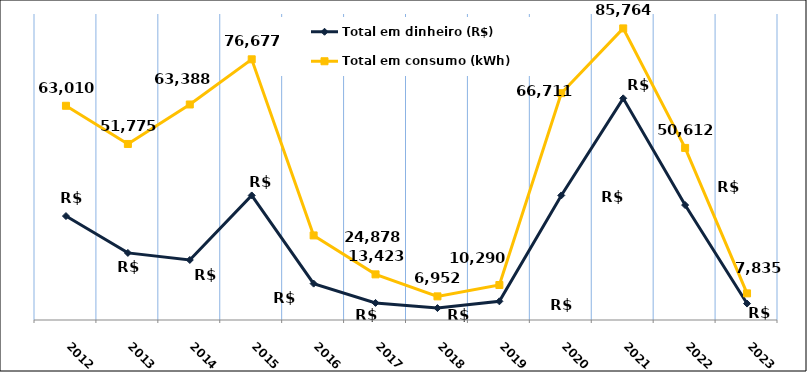
| Category | Total em dinheiro (R$) | Total em consumo (kWh) |
|---|---|---|
| 2012.0 | 30573.18 | 63010 |
| 2013.0 | 19732.31 | 51775 |
| 2014.0 | 17653.96 | 63388 |
| 2015.0 | 36633.46 | 76677 |
| 2016.0 | 10702.76 | 24878 |
| 2017.0 | 5021.46 | 13423 |
| 2018.0 | 3506.63 | 6952 |
| 2019.0 | 5488.54 | 10290 |
| 2020.0 | 36633.97 | 66711 |
| 2021.0 | 65195 | 85764 |
| 2022.0 | 33801.18 | 50612 |
| 2023.0 | 4834.51 | 7835 |